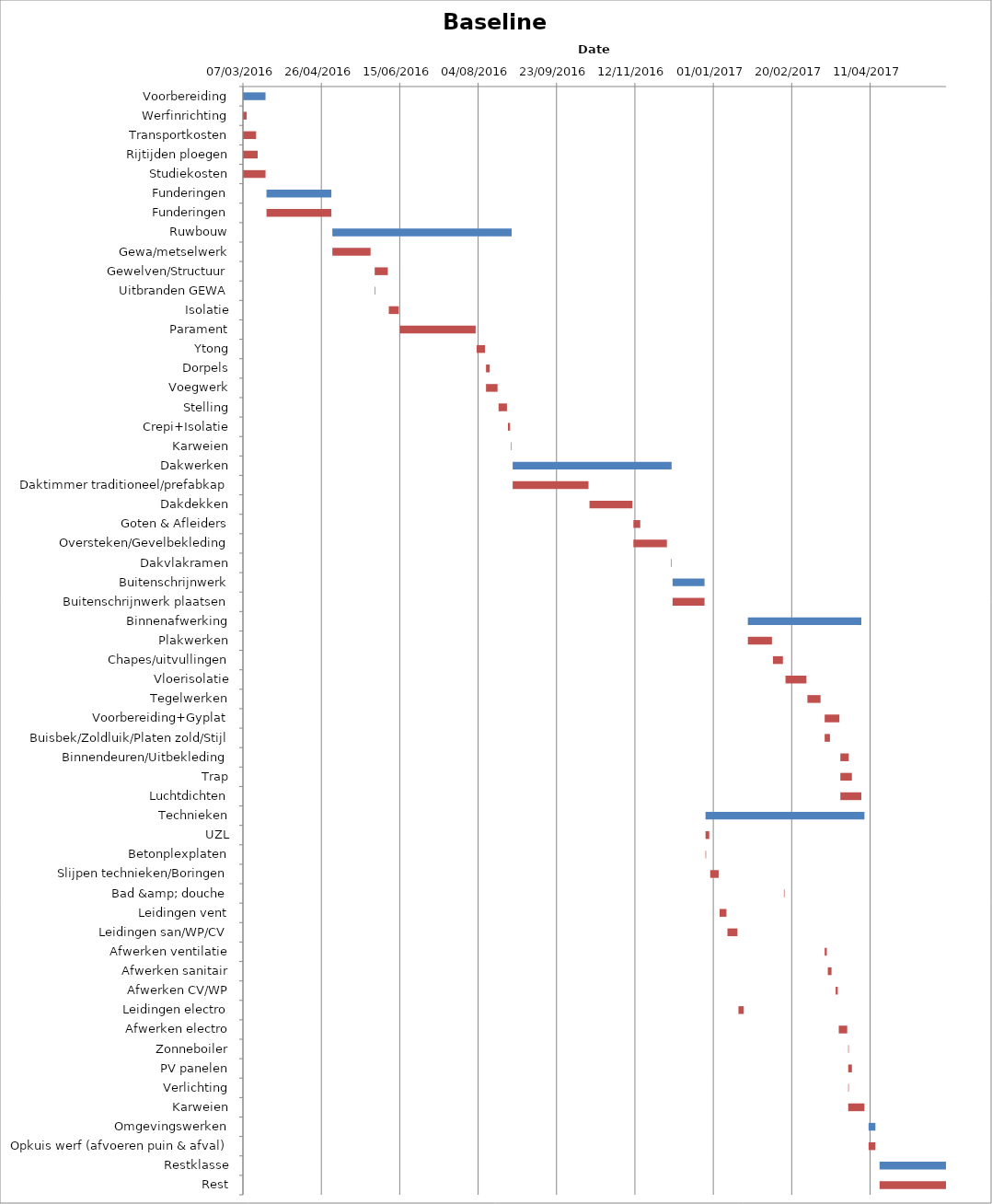
| Category | Baseline start | Actual duration |
|---|---|---|
| Voorbereiding | 42436.333 | 14.375 |
| Werfinrichting | 42436.333 | 2.375 |
| Transportkosten | 42436.333 | 8.375 |
| Rijtijden ploegen | 42436.333 | 9.375 |
| Studiekosten | 42436.333 | 14.375 |
| Funderingen | 42451.333 | 41.375 |
| Funderingen | 42451.333 | 41.375 |
| Ruwbouw | 42493.333 | 114.375 |
| Gewa/metselwerk | 42493.333 | 24.375 |
| Gewelven/Structuur | 42520.333 | 8.375 |
| Uitbranden GEWA | 42520.333 | 0.375 |
| Isolatie | 42529.333 | 6.375 |
| Parament | 42536.333 | 48.375 |
| Ytong | 42585.333 | 5.375 |
| Dorpels | 42591.333 | 2.375 |
| Voegwerk | 42591.333 | 7.375 |
| Stelling | 42599.333 | 5.375 |
| Crepi+Isolatie | 42605.333 | 1.375 |
| Karweien | 42607.333 | 0.375 |
| Dakwerken | 42608.333 | 101.375 |
| Daktimmer traditioneel/prefabkap | 42608.333 | 48.375 |
| Dakdekken | 42657.333 | 27.375 |
| Goten & Afleiders | 42685.333 | 4.375 |
| Oversteken/Gevelbekleding | 42685.333 | 21.375 |
| Dakvlakramen | 42709.333 | 0.375 |
| Buitenschrijnwerk | 42710.333 | 20.375 |
| Buitenschrijnwerk plaatsen | 42710.333 | 20.375 |
| Binnenafwerking | 42758.333 | 72.375 |
| Plakwerken | 42758.333 | 15.375 |
| Chapes/uitvullingen | 42774.333 | 6.375 |
| Vloerisolatie | 42782.333 | 13.375 |
| Tegelwerken | 42796.333 | 8.375 |
| Voorbereiding+Gyplat | 42807.333 | 9.375 |
| Buisbek/Zoldluik/Platen zold/Stijl | 42807.333 | 3.375 |
| Binnendeuren/Uitbekleding | 42817.333 | 5.375 |
| Trap | 42817.333 | 7.375 |
| Luchtdichten | 42817.333 | 13.375 |
| Technieken | 42731.333 | 101.375 |
| UZL | 42731.333 | 2.375 |
| Betonplexplaten | 42731.333 | 0.375 |
| Slijpen technieken/Boringen | 42734.333 | 5.375 |
| Bad &amp; douche | 42781.333 | 0.375 |
| Leidingen vent | 42740.333 | 4.375 |
| Leidingen san/WP/CV | 42745.333 | 6.375 |
| Afwerken ventilatie | 42807.333 | 1.375 |
| Afwerken sanitair | 42809.333 | 2.375 |
| Afwerken CV/WP | 42814.333 | 1.375 |
| Leidingen electro | 42752.333 | 3.375 |
| Afwerken electro | 42816.333 | 5.375 |
| Zonneboiler | 42822.333 | 0.375 |
| PV panelen | 42822.333 | 2.375 |
| Verlichting | 42822.333 | 0.375 |
| Karweien | 42822.333 | 10.375 |
| Omgevingswerken | 42835.333 | 4.375 |
| Opkuis werf (afvoeren puin & afval) | 42835.333 | 4.375 |
| Restklasse | 42842.333 | 42.375 |
| Rest | 42842.333 | 42.375 |